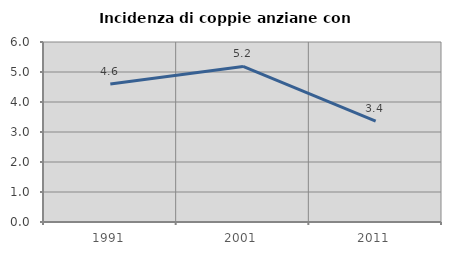
| Category | Incidenza di coppie anziane con figli |
|---|---|
| 1991.0 | 4.598 |
| 2001.0 | 5.185 |
| 2011.0 | 3.361 |